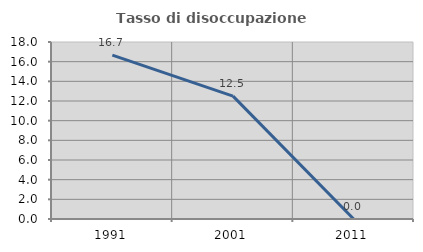
| Category | Tasso di disoccupazione giovanile  |
|---|---|
| 1991.0 | 16.667 |
| 2001.0 | 12.5 |
| 2011.0 | 0 |